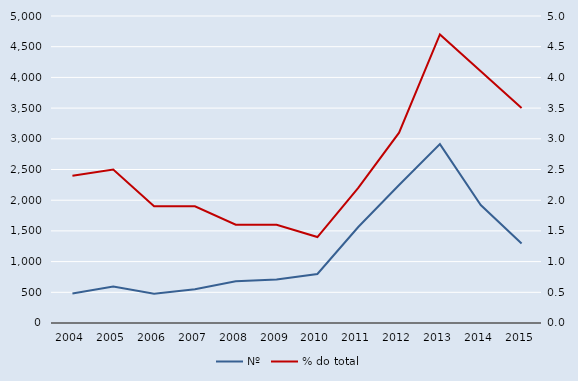
| Category | Nº |
|---|---|
| 2004.0 | 482 |
| 2005.0 | 595 |
| 2006.0 | 477 |
| 2007.0 | 550 |
| 2008.0 | 679 |
| 2009.0 | 708 |
| 2010.0 | 798 |
| 2011.0 | 1564 |
| 2012.0 | 2247 |
| 2013.0 | 2913 |
| 2014.0 | 1921 |
| 2015.0 | 1294 |